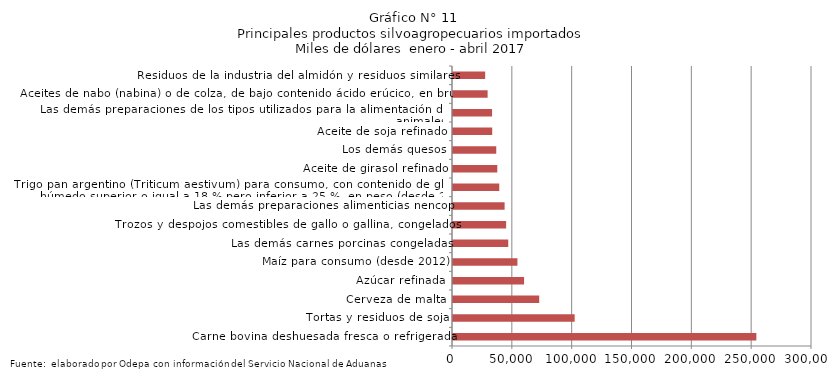
| Category | Series 0 |
|---|---|
| Carne bovina deshuesada fresca o refrigerada | 253512.186 |
| Tortas y residuos de soja | 101667.104 |
| Cerveza de malta | 72045.979 |
| Azúcar refinada | 59393.29 |
| Maíz para consumo (desde 2012) | 53839.145 |
| Las demás carnes porcinas congeladas | 46171.903 |
| Trozos y despojos comestibles de gallo o gallina, congelados | 44392.046 |
| Las demás preparaciones alimenticias nencop | 43124.558 |
| Trigo pan argentino (Triticum aestivum) para consumo, con contenido de gluten húmedo superior o igual a 18 % pero inferior a 25 %, en peso (desde 2012) | 38665.078 |
| Aceite de girasol refinado | 37016.435 |
| Los demás quesos | 36143.67 |
| Aceite de soja refinado | 32776.781 |
| Las demás preparaciones de los tipos utilizados para la alimentación de los animales | 32646.418 |
| Aceites de nabo (nabina) o de colza, de bajo contenido ácido erúcico, en bruto | 28930.394 |
| Residuos de la industria del almidón y residuos similares | 26874.114 |